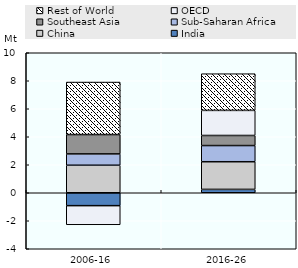
| Category | India | China | Sub-Saharan Africa | Southeast Asia | OECD | Rest of World |
|---|---|---|---|---|---|---|
| 2006-16 | -0.921 | 1.966 | 0.808 | 1.382 | -1.366 | 3.752 |
| 2016-26 | 0.24 | 1.976 | 1.155 | 0.72 | 1.792 | 2.621 |